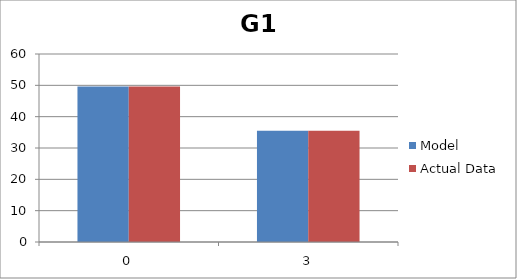
| Category | Model | Actual Data |
|---|---|---|
| 0.0 | 49.64 | 49.64 |
| 3.0 | 35.47 | 35.5 |